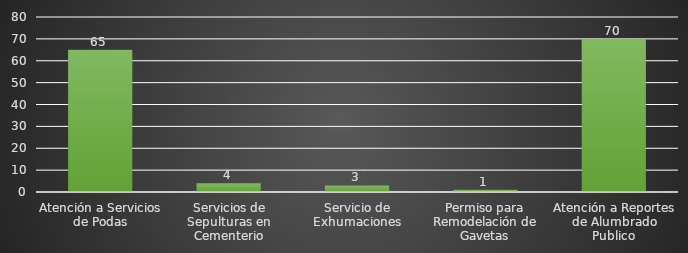
| Category | INDICADOR  |
|---|---|
| Atención a Servicios de Podas | 65 |
| Servicios de Sepulturas en Cementerio | 4 |
| Servicio de Exhumaciones | 3 |
| Permiso para Remodelación de Gavetas | 1 |
| Atención a Reportes de Alumbrado Publico | 70 |